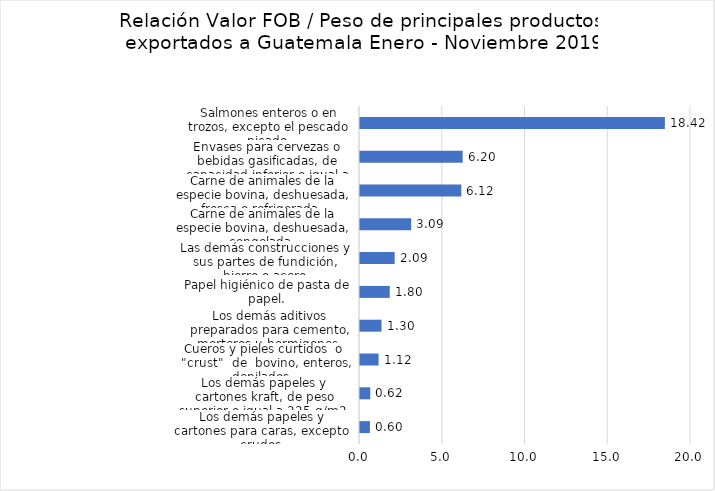
| Category | Series 0 |
|---|---|
| Los demás papeles y cartones para caras, excepto crudos. | 0.6 |
| Los demás papeles y cartones kraft, de peso superior o igual a 225 g/m2, sin estucar ni recubrir. | 0.621 |
| Cueros y pieles curtidos  o  "crust"  de  bovino, enteros, depilados,  | 1.124 |
| Los demás aditivos preparados para cemento, morteros u hormigones. | 1.299 |
| Papel higiénico de pasta de papel. | 1.799 |
| Las demás construcciones y sus partes de fundición, hierro o acero | 2.095 |
| Carne de animales de la especie bovina, deshuesada, congelada. | 3.093 |
| Carne de animales de la especie bovina, deshuesada, fresca o refrigerada. | 6.125 |
| Envases para cervezas o bebidas gasificadas, de capacidad inferior o igual a 300 l, de aluminio. | 6.205 |
| Salmones enteros o en trozos, excepto el pescado picado. | 18.423 |